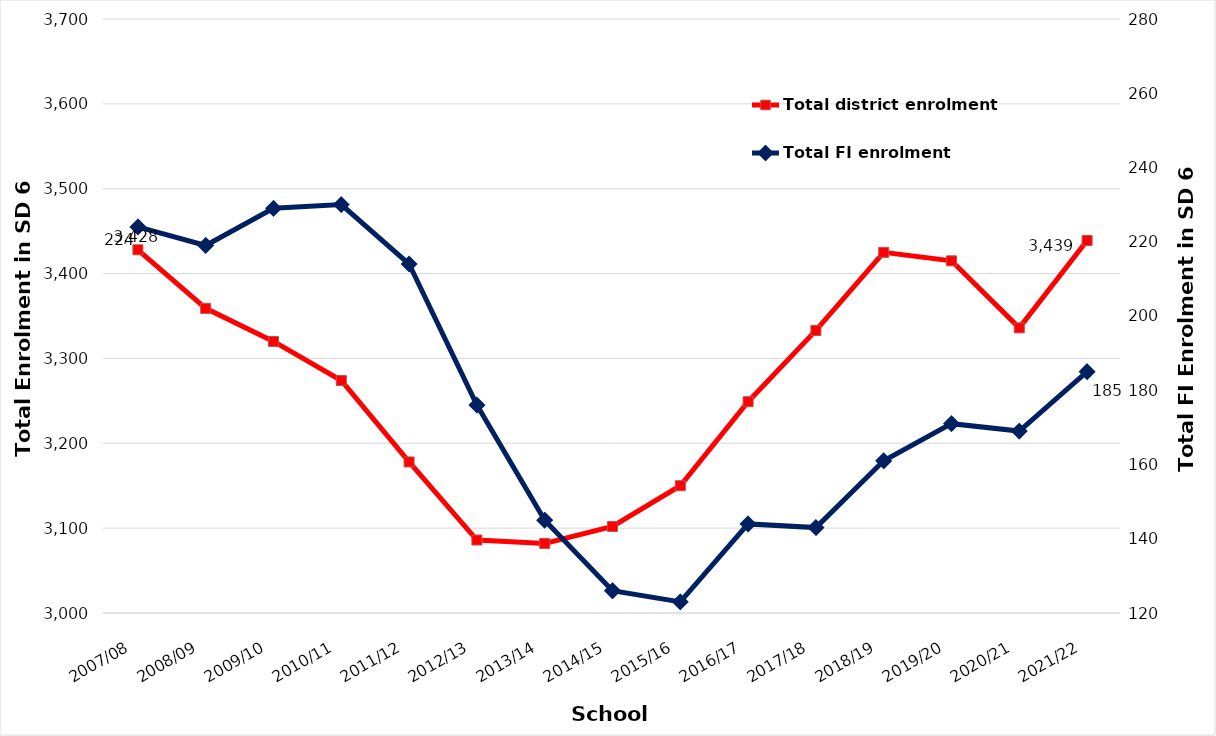
| Category | Total district enrolment  |
|---|---|
| 2007/08 | 3428 |
| 2008/09 | 3359 |
| 2009/10 | 3320 |
| 2010/11 | 3274 |
| 2011/12 | 3178 |
| 2012/13 | 3086 |
| 2013/14 | 3082 |
| 2014/15 | 3102 |
| 2015/16 | 3150 |
| 2016/17 | 3249 |
| 2017/18 | 3333 |
| 2018/19 | 3425 |
| 2019/20 | 3415 |
| 2020/21 | 3336 |
| 2021/22 | 3439 |